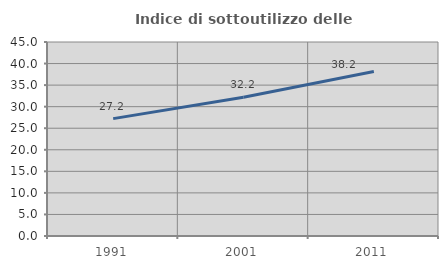
| Category | Indice di sottoutilizzo delle abitazioni  |
|---|---|
| 1991.0 | 27.226 |
| 2001.0 | 32.187 |
| 2011.0 | 38.156 |